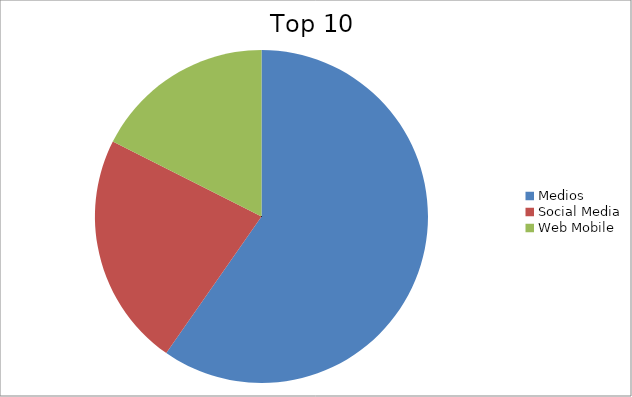
| Category | Series 0 |
|---|---|
| Medios | 59.69 |
| Social Media | 22.74 |
| Web Mobile | 17.57 |